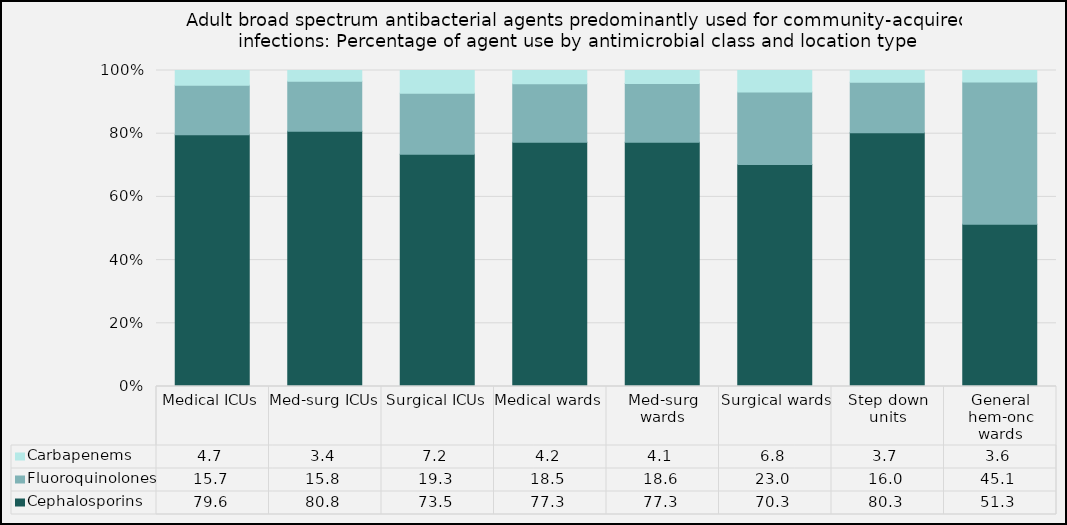
| Category | Cephalosporins | Fluoroquinolones | Carbapenems |
|---|---|---|---|
| Medical ICUs | 79.63 | 15.67 | 4.7 |
| Med-surg ICUs | 80.79 | 15.84 | 3.37 |
| Surgical ICUs | 73.47 | 19.33 | 7.2 |
| Medical wards | 77.3 | 18.53 | 4.17 |
| Med-surg wards | 77.27 | 18.64 | 4.09 |
| Surgical wards | 70.25 | 22.99 | 6.77 |
| Step down units | 80.3 | 15.96 | 3.74 |
| General hem-onc wards | 51.33 | 45.05 | 3.62 |